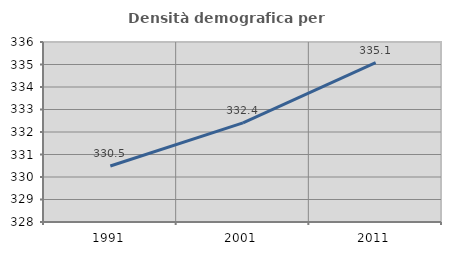
| Category | Densità demografica |
|---|---|
| 1991.0 | 330.489 |
| 2001.0 | 332.407 |
| 2011.0 | 335.08 |